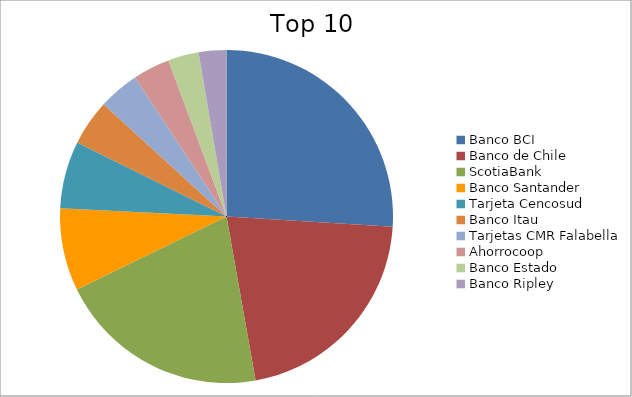
| Category | Series 0 |
|---|---|
| Banco BCI | 25.98 |
| Banco de Chile | 21.22 |
| ScotiaBank | 20.57 |
| Banco Santander | 8 |
| Tarjeta Cencosud | 6.54 |
| Banco Itau | 4.46 |
| Tarjetas CMR Falabella | 3.96 |
| Ahorrocoop | 3.59 |
| Banco Estado | 2.98 |
| Banco Ripley | 2.69 |